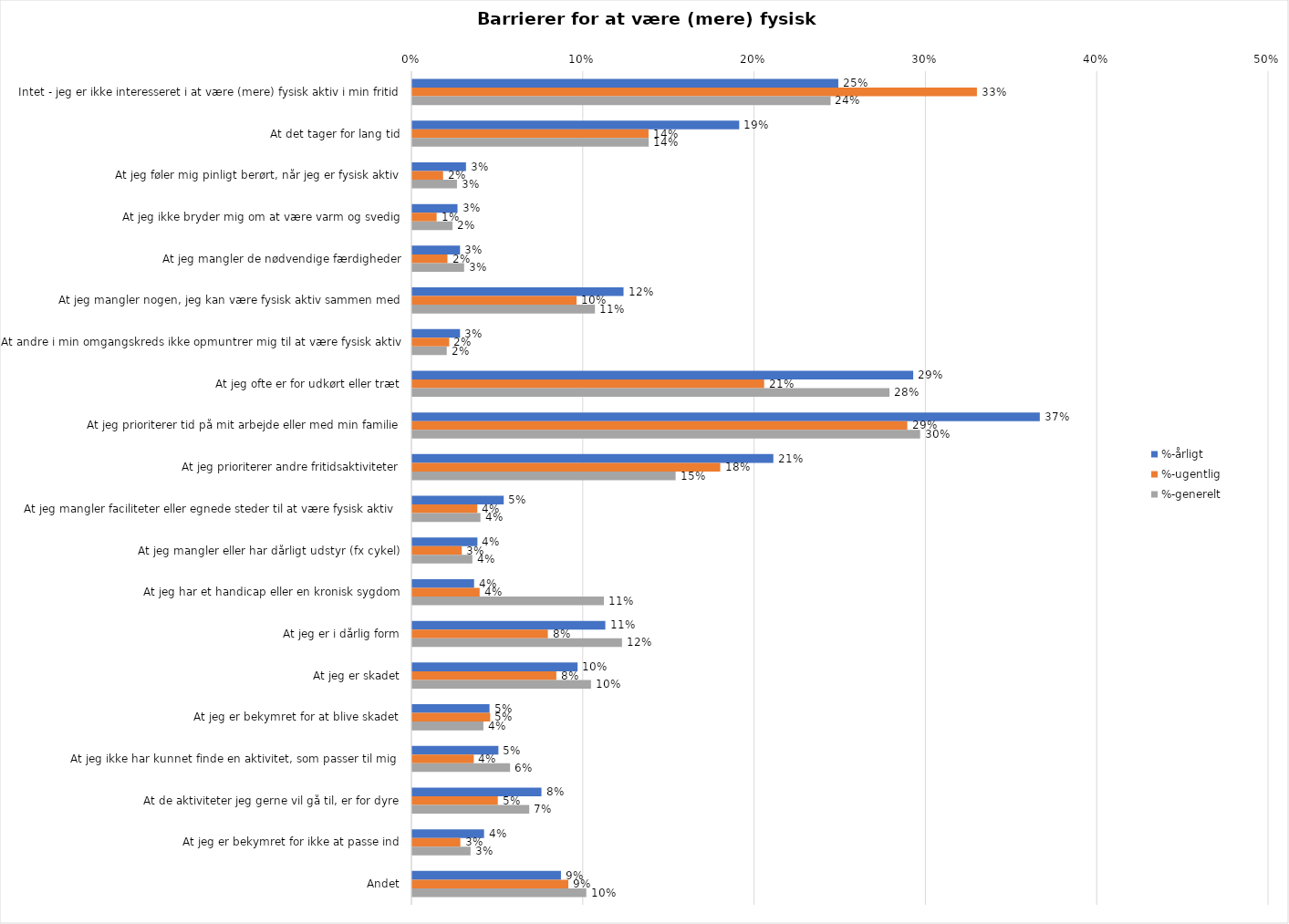
| Category | %-årligt | %-ugentlig | %-generelt |
|---|---|---|---|
| Intet - jeg er ikke interesseret i at være (mere) fysisk aktiv i min fritid | 0.249 | 0.33 | 0.244 |
| At det tager for lang tid | 0.191 | 0.138 | 0.138 |
| At jeg føler mig pinligt berørt, når jeg er fysisk aktiv | 0.031 | 0.018 | 0.026 |
| At jeg ikke bryder mig om at være varm og svedig | 0.026 | 0.014 | 0.023 |
| At jeg mangler de nødvendige færdigheder | 0.028 | 0.021 | 0.03 |
| At jeg mangler nogen, jeg kan være fysisk aktiv sammen med | 0.123 | 0.096 | 0.107 |
| At andre i min omgangskreds ikke opmuntrer mig til at være fysisk aktiv | 0.028 | 0.022 | 0.02 |
| At jeg ofte er for udkørt eller træt | 0.292 | 0.205 | 0.279 |
| At jeg prioriterer tid på mit arbejde eller med min familie | 0.366 | 0.289 | 0.296 |
| At jeg prioriterer andre fritidsaktiviteter | 0.211 | 0.18 | 0.154 |
| At jeg mangler faciliteter eller egnede steder til at være fysisk aktiv  | 0.053 | 0.038 | 0.04 |
| At jeg mangler eller har dårligt udstyr (fx cykel) | 0.038 | 0.029 | 0.035 |
| At jeg har et handicap eller en kronisk sygdom | 0.036 | 0.039 | 0.112 |
| At jeg er i dårlig form | 0.113 | 0.079 | 0.122 |
| At jeg er skadet | 0.096 | 0.084 | 0.104 |
| At jeg er bekymret for at blive skadet | 0.045 | 0.045 | 0.041 |
| At jeg ikke har kunnet finde en aktivitet, som passer til mig  | 0.05 | 0.036 | 0.057 |
| At de aktiviteter jeg gerne vil gå til, er for dyre | 0.075 | 0.05 | 0.068 |
| At jeg er bekymret for ikke at passe ind | 0.042 | 0.028 | 0.034 |
| Andet | 0.087 | 0.091 | 0.102 |